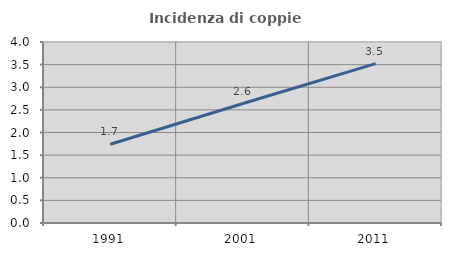
| Category | Incidenza di coppie miste |
|---|---|
| 1991.0 | 1.741 |
| 2001.0 | 2.64 |
| 2011.0 | 3.523 |